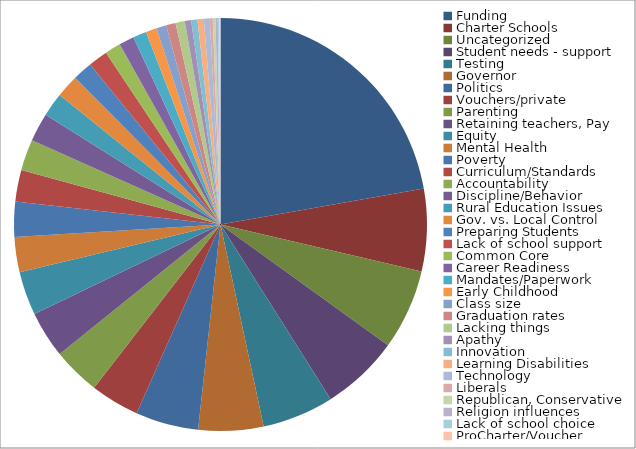
| Category | Series 0 | Series 1 |
|---|---|---|
| Funding | 0.297 | 860 |
| Charter Schools | 0.086 | 250 |
| Uncategorized | 0.084 | 244 |
| Student needs - support | 0.082 | 236 |
| Testing | 0.075 | 217 |
| Governor | 0.068 | 197 |
| Politics | 0.066 | 191 |
| Vouchers/private | 0.051 | 148 |
| Parenting | 0.05 | 144 |
| Retaining teachers, Pay | 0.049 | 142 |
| Equity | 0.046 | 132 |
| Mental Health | 0.037 | 107 |
| Poverty | 0.037 | 106 |
| Curriculum/Standards | 0.033 | 96 |
| Accountability | 0.032 | 94 |
| Discipline/Behavior | 0.03 | 87 |
| Rural Education Issues | 0.025 | 72 |
| Gov. vs. Local Control | 0.024 | 69 |
| Preparing Students | 0.021 | 60 |
| Lack of school support | 0.02 | 59 |
| Common Core | 0.017 | 48 |
| Career Readiness | 0.016 | 46 |
| Mandates/Paperwork | 0.014 | 41 |
| Early Childhood | 0.011 | 33 |
| Class size | 0.01 | 30 |
| Graduation rates | 0.01 | 29 |
| Lacking things | 0.01 | 28 |
| Apathy | 0.007 | 19 |
| Innovation | 0.007 | 19 |
| Learning Disabilities | 0.007 | 19 |
| Technology | 0.006 | 18 |
| Liberals | 0.003 | 9 |
| Republican, Conservative | 0.003 | 8 |
| Religion influences | 0.002 | 7 |
| Lack of school choice | 0.001 | 4 |
| ProCharter/Voucher | 0.001 | 2 |
| Random, N/A answers | 0.001 | 2 |